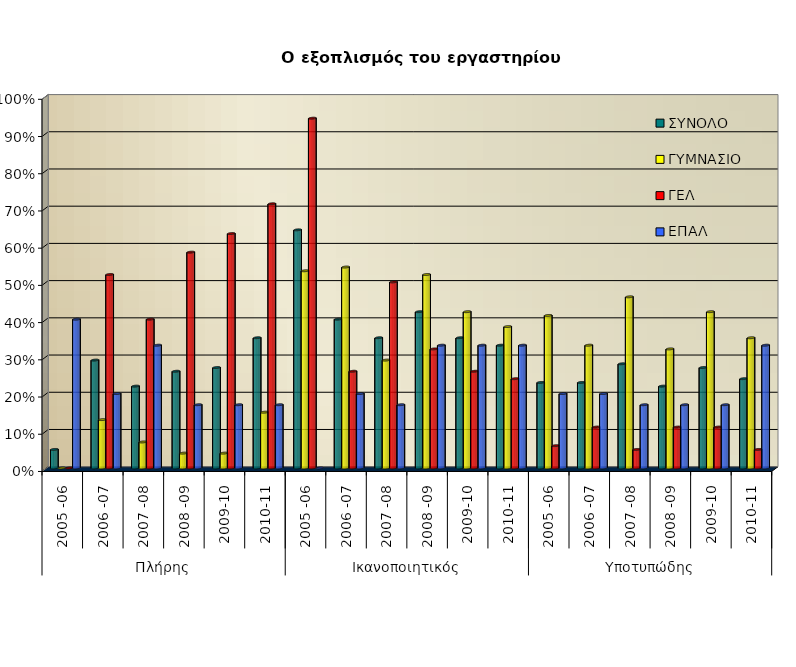
| Category | ΣΥΝΟΛΟ | ΓΥΜΝΑΣΙΟ | ΓΕΛ | ΕΠΑΛ |
|---|---|---|---|---|
| 0 | 0.05 | 0 | 0 | 0.4 |
| 1 | 0.29 | 0.13 | 0.52 | 0.2 |
| 2 | 0.22 | 0.07 | 0.4 | 0.33 |
| 3 | 0.26 | 0.04 | 0.58 | 0.17 |
| 4 | 0.27 | 0.04 | 0.63 | 0.17 |
| 5 | 0.35 | 0.15 | 0.71 | 0.17 |
| 6 | 0.64 | 0.53 | 0.94 | 0 |
| 7 | 0.4 | 0.54 | 0.26 | 0.2 |
| 8 | 0.35 | 0.29 | 0.5 | 0.17 |
| 9 | 0.42 | 0.52 | 0.32 | 0.33 |
| 10 | 0.35 | 0.42 | 0.26 | 0.33 |
| 11 | 0.33 | 0.38 | 0.24 | 0.33 |
| 12 | 0.23 | 0.41 | 0.06 | 0.2 |
| 13 | 0.23 | 0.33 | 0.11 | 0.2 |
| 14 | 0.28 | 0.46 | 0.05 | 0.17 |
| 15 | 0.22 | 0.32 | 0.11 | 0.17 |
| 16 | 0.27 | 0.42 | 0.11 | 0.17 |
| 17 | 0.24 | 0.35 | 0.05 | 0.33 |